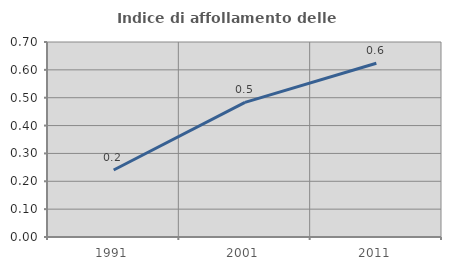
| Category | Indice di affollamento delle abitazioni  |
|---|---|
| 1991.0 | 0.24 |
| 2001.0 | 0.483 |
| 2011.0 | 0.624 |